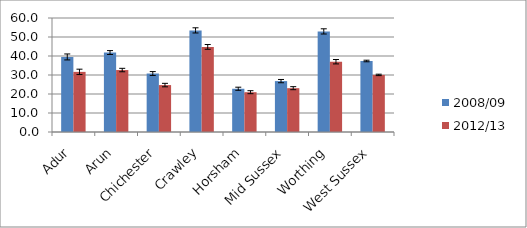
| Category | 2008/09 | 2012/13 |
|---|---|---|
| Adur | 39.505 | 31.646 |
| Arun | 41.813 | 32.608 |
| Chichester | 30.782 | 24.694 |
| Crawley | 53.478 | 44.791 |
| Horsham | 22.761 | 20.952 |
| Mid Sussex | 26.785 | 23.062 |
| Worthing | 52.944 | 36.991 |
| West Sussex | 37.37 | 30.051 |